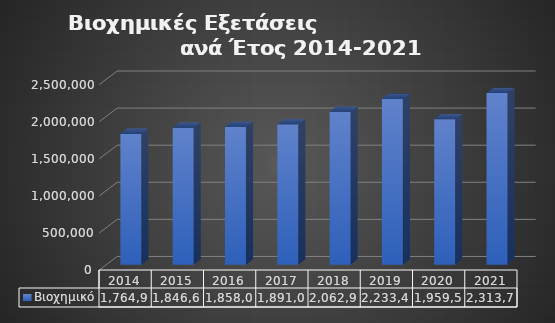
| Category | Βιοχημικό  |
|---|---|
| 2014.0 | 1764931 |
| 2015.0 | 1846668 |
| 2016.0 | 1858043 |
| 2017.0 | 1891076 |
| 2018.0 | 2062962 |
| 2019.0 | 2233478 |
| 2020.0 | 1959519 |
| 2021.0 | 2313729 |